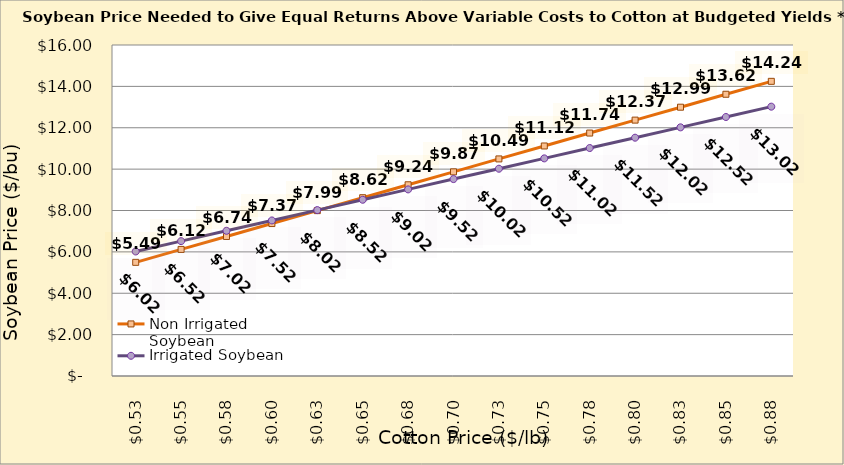
| Category | Non Irrigated Soybean | Irrigated Soybean |
|---|---|---|
| 0.5249999999999998 | 5.494 | 6.019 |
| 0.5499999999999998 | 6.119 | 6.519 |
| 0.5749999999999998 | 6.744 | 7.019 |
| 0.5999999999999999 | 7.369 | 7.519 |
| 0.6249999999999999 | 7.994 | 8.019 |
| 0.6499999999999999 | 8.619 | 8.519 |
| 0.6749999999999999 | 9.244 | 9.019 |
| 0.7 | 9.869 | 9.519 |
| 0.725 | 10.494 | 10.019 |
| 0.75 | 11.119 | 10.519 |
| 0.775 | 11.744 | 11.019 |
| 0.8 | 12.369 | 11.519 |
| 0.8250000000000001 | 12.994 | 12.019 |
| 0.8500000000000001 | 13.619 | 12.519 |
| 0.8750000000000001 | 14.244 | 13.019 |